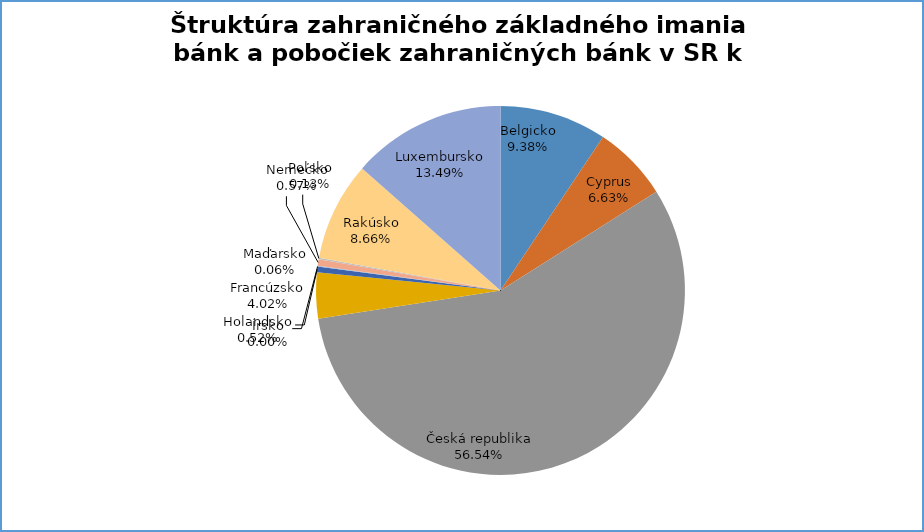
| Category | Series 0 |
|---|---|
| Belgicko | 0.094 |
| Cyprus | 0.066 |
| Česká republika | 0.565 |
| Francúzsko | 0.04 |
| Holandsko | 0.005 |
| Írsko | 0 |
| Maďarsko | 0.001 |
| Nemecko | 0.006 |
| Poľsko | 0.001 |
| Rakúsko | 0.087 |
| Luxembursko | 0.135 |